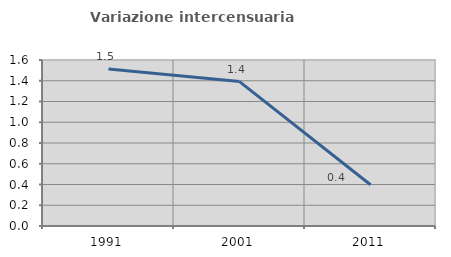
| Category | Variazione intercensuaria annua |
|---|---|
| 1991.0 | 1.514 |
| 2001.0 | 1.392 |
| 2011.0 | 0.398 |